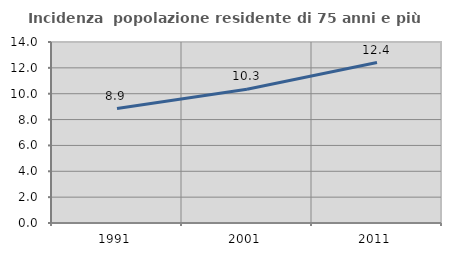
| Category | Incidenza  popolazione residente di 75 anni e più |
|---|---|
| 1991.0 | 8.856 |
| 2001.0 | 10.348 |
| 2011.0 | 12.408 |